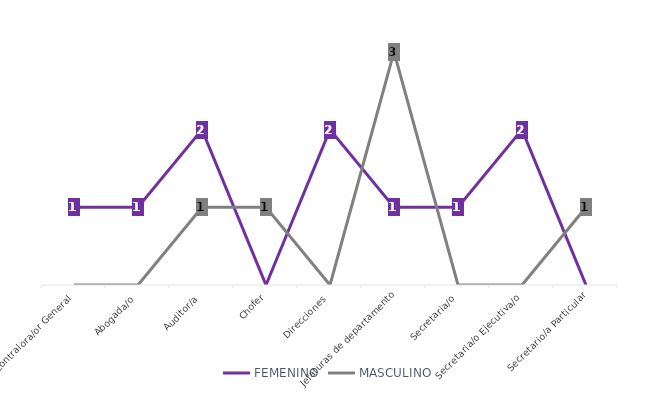
| Category | FEMENINO | MASCULINO |
|---|---|---|
| Contralora/or General | 1 | 0 |
| Abogada/o | 1 | 0 |
| Auditor/a | 2 | 1 |
| Chofer | 0 | 1 |
| Direcciones | 2 | 0 |
| Jefaturas de departamento | 1 | 3 |
| Secretaria/o | 1 | 0 |
| Secretaria/o Ejecutiva/o | 2 | 0 |
| Secretario/a Particular | 0 | 1 |